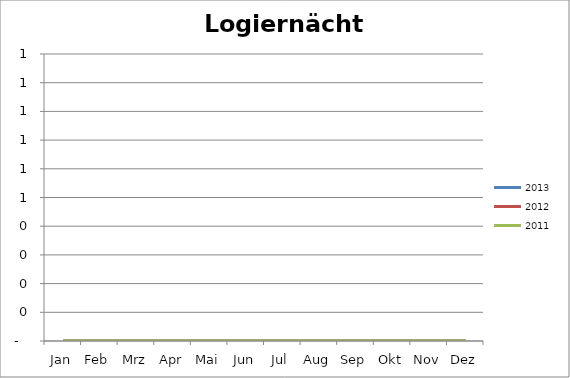
| Category | 2013 | 2012 | 2011 |
|---|---|---|---|
| Jan | 0 | 0 | 0 |
| Feb | 0 | 0 | 0 |
| Mrz | 0 | 0 | 0 |
| Apr | 0 | 0 | 0 |
| Mai | 0 | 0 | 0 |
| Jun | 0 | 0 | 0 |
| Jul | 0 | 0 | 0 |
| Aug | 0 | 0 | 0 |
| Sep | 0 | 0 | 0 |
| Okt | 0 | 0 | 0 |
| Nov | 0 | 0 | 0 |
| Dez | 0 | 0 | 0 |